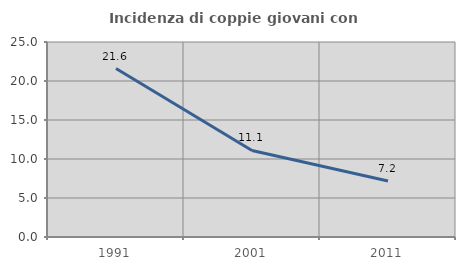
| Category | Incidenza di coppie giovani con figli |
|---|---|
| 1991.0 | 21.6 |
| 2001.0 | 11.095 |
| 2011.0 | 7.188 |